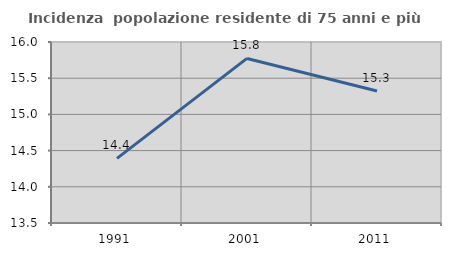
| Category | Incidenza  popolazione residente di 75 anni e più |
|---|---|
| 1991.0 | 14.393 |
| 2001.0 | 15.773 |
| 2011.0 | 15.324 |